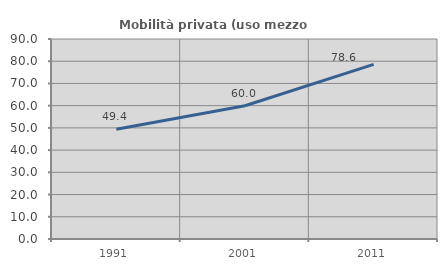
| Category | Mobilità privata (uso mezzo privato) |
|---|---|
| 1991.0 | 49.374 |
| 2001.0 | 59.963 |
| 2011.0 | 78.571 |